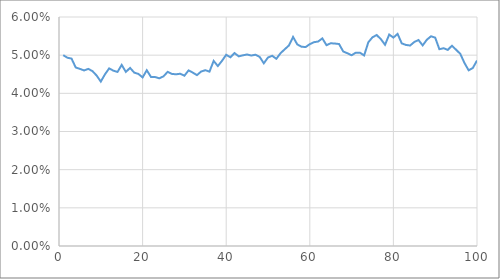
| Category | Series 0 |
|---|---|
| 0 | 0.05 |
| 1 | 0.049 |
| 2 | 0.049 |
| 3 | 0.047 |
| 4 | 0.046 |
| 5 | 0.046 |
| 6 | 0.046 |
| 7 | 0.046 |
| 8 | 0.045 |
| 9 | 0.043 |
| 10 | 0.045 |
| 11 | 0.047 |
| 12 | 0.046 |
| 13 | 0.046 |
| 14 | 0.047 |
| 15 | 0.046 |
| 16 | 0.047 |
| 17 | 0.045 |
| 18 | 0.045 |
| 19 | 0.044 |
| 20 | 0.046 |
| 21 | 0.044 |
| 22 | 0.044 |
| 23 | 0.044 |
| 24 | 0.044 |
| 25 | 0.046 |
| 26 | 0.045 |
| 27 | 0.045 |
| 28 | 0.045 |
| 29 | 0.045 |
| 30 | 0.046 |
| 31 | 0.045 |
| 32 | 0.045 |
| 33 | 0.046 |
| 34 | 0.046 |
| 35 | 0.046 |
| 36 | 0.048 |
| 37 | 0.047 |
| 38 | 0.049 |
| 39 | 0.05 |
| 40 | 0.049 |
| 41 | 0.051 |
| 42 | 0.05 |
| 43 | 0.05 |
| 44 | 0.05 |
| 45 | 0.05 |
| 46 | 0.05 |
| 47 | 0.05 |
| 48 | 0.048 |
| 49 | 0.049 |
| 50 | 0.05 |
| 51 | 0.049 |
| 52 | 0.051 |
| 53 | 0.052 |
| 54 | 0.053 |
| 55 | 0.055 |
| 56 | 0.053 |
| 57 | 0.052 |
| 58 | 0.052 |
| 59 | 0.053 |
| 60 | 0.053 |
| 61 | 0.054 |
| 62 | 0.054 |
| 63 | 0.053 |
| 64 | 0.053 |
| 65 | 0.053 |
| 66 | 0.053 |
| 67 | 0.051 |
| 68 | 0.051 |
| 69 | 0.05 |
| 70 | 0.051 |
| 71 | 0.051 |
| 72 | 0.05 |
| 73 | 0.053 |
| 74 | 0.055 |
| 75 | 0.055 |
| 76 | 0.054 |
| 77 | 0.053 |
| 78 | 0.055 |
| 79 | 0.055 |
| 80 | 0.056 |
| 81 | 0.053 |
| 82 | 0.053 |
| 83 | 0.053 |
| 84 | 0.053 |
| 85 | 0.054 |
| 86 | 0.053 |
| 87 | 0.054 |
| 88 | 0.055 |
| 89 | 0.055 |
| 90 | 0.052 |
| 91 | 0.052 |
| 92 | 0.051 |
| 93 | 0.052 |
| 94 | 0.051 |
| 95 | 0.05 |
| 96 | 0.048 |
| 97 | 0.046 |
| 98 | 0.047 |
| 99 | 0.049 |